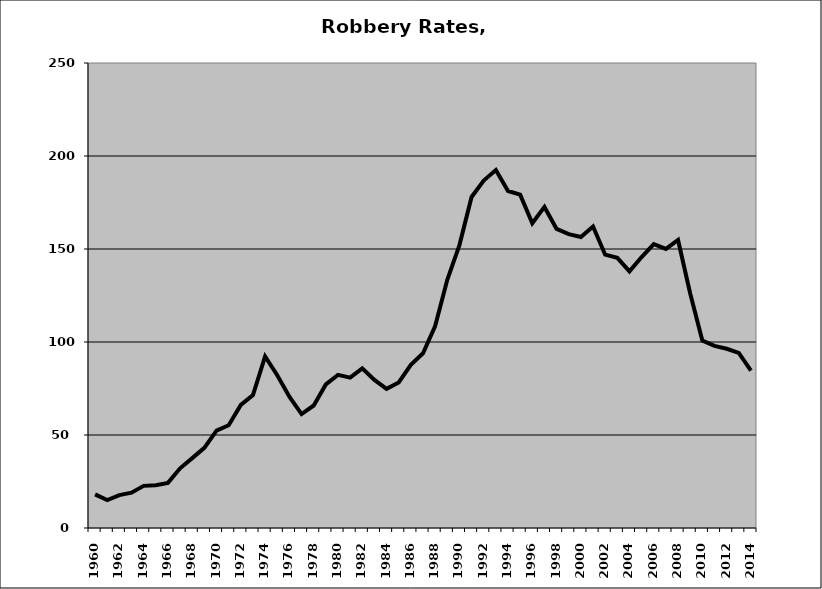
| Category | Robbery |
|---|---|
| 1960.0 | 18.107 |
| 1961.0 | 15.041 |
| 1962.0 | 17.671 |
| 1963.0 | 18.971 |
| 1964.0 | 22.65 |
| 1965.0 | 22.975 |
| 1966.0 | 24.26 |
| 1967.0 | 32.094 |
| 1968.0 | 37.566 |
| 1969.0 | 43.112 |
| 1970.0 | 52.341 |
| 1971.0 | 55.266 |
| 1972.0 | 66.206 |
| 1973.0 | 71.42 |
| 1974.0 | 92.262 |
| 1975.0 | 82.168 |
| 1976.0 | 70.561 |
| 1977.0 | 61.267 |
| 1978.0 | 65.86 |
| 1979.0 | 77.185 |
| 1980.0 | 82.311 |
| 1981.0 | 80.81 |
| 1982.0 | 85.861 |
| 1983.0 | 79.579 |
| 1984.0 | 74.809 |
| 1985.0 | 78.225 |
| 1986.0 | 87.68 |
| 1987.0 | 93.919 |
| 1988.0 | 108.566 |
| 1989.0 | 133.465 |
| 1990.0 | 152.098 |
| 1991.0 | 177.972 |
| 1992.0 | 186.819 |
| 1993.0 | 192.426 |
| 1994.0 | 181.202 |
| 1995.0 | 179.236 |
| 1996.0 | 163.881 |
| 1997.0 | 172.62 |
| 1998.0 | 160.787 |
| 1999.0 | 157.984 |
| 2000.0 | 156.473 |
| 2001.0 | 162.123 |
| 2002.0 | 146.945 |
| 2003.0 | 145.217 |
| 2004.0 | 137.955 |
| 2005.0 | 145.691 |
| 2006.0 | 152.611 |
| 2007.0 | 150.049 |
| 2008.0 | 154.87 |
| 2009.0 | 126.054 |
| 2010.0 | 100.781 |
| 2011.0 | 97.896 |
| 2012.0 | 96.344 |
| 2013.0 | 94.173 |
| 2014.0 | 84.634 |